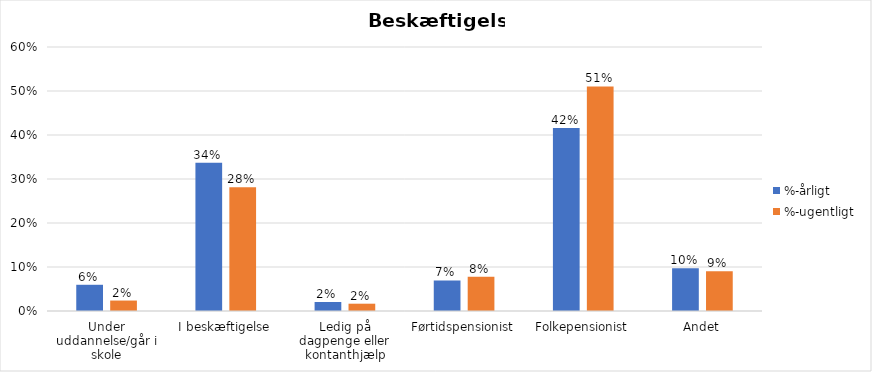
| Category | %-årligt | %-ugentligt |
|---|---|---|
| Under uddannelse/går i skole | 0.06 | 0.024 |
| I beskæftigelse | 0.337 | 0.281 |
| Ledig på dagpenge eller kontanthjælp | 0.02 | 0.017 |
| Førtidspensionist | 0.069 | 0.078 |
| Folkepensionist | 0.416 | 0.51 |
| Andet | 0.097 | 0.09 |